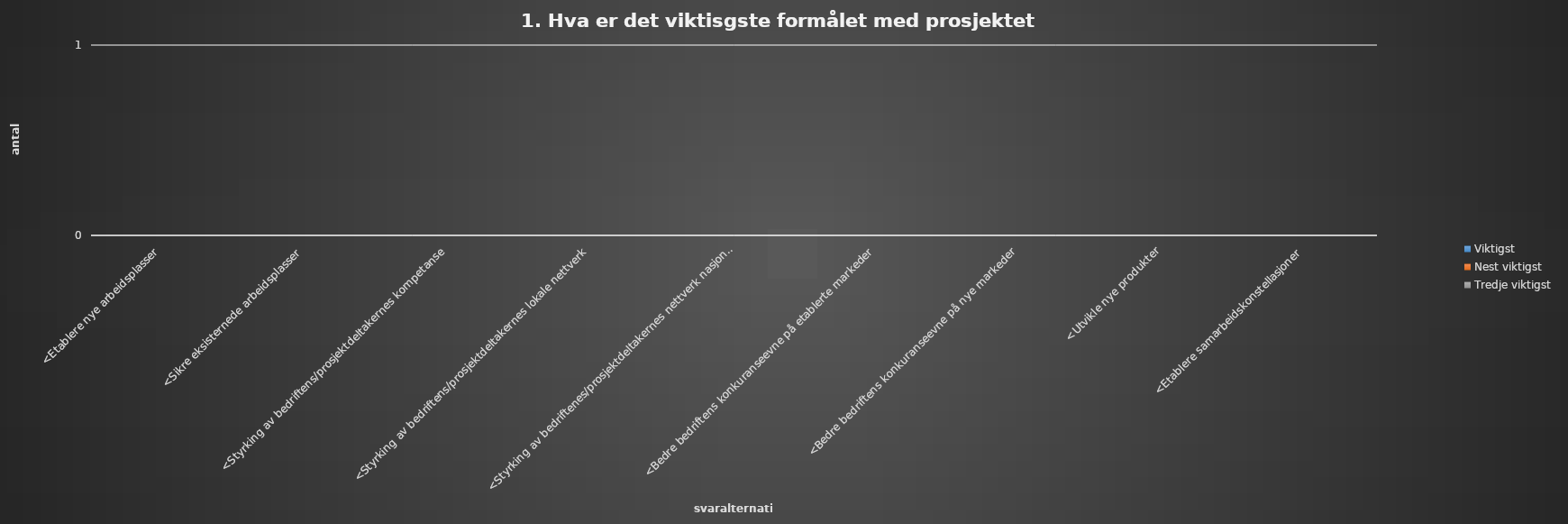
| Category | Viktigst | Nest viktigst | Tredje viktigst |
|---|---|---|---|
| <Etablere nye arbeidsplasser | 0 | 0 | 0 |
| <Sikre eksisternede arbeidsplasser | 0 | 0 | 0 |
| <Styrking av bedriftens/prosjektdeltakernes kompetanse | 0 | 0 | 0 |
| <Styrking av bedriftens/prosjektdeltakernes lokale nettverk | 0 | 0 | 0 |
| <Styrking av bedriftenes/prosjektdeltakernes nettverk nasjonalt og internasjonalt | 0 | 0 | 0 |
| <Bedre bedriftens konkuranseevne på etablerte markeder | 0 | 0 | 0 |
| <Bedre bedriftens konkuranseevne på nye markeder | 0 | 0 | 0 |
| <Utvikle nye produkter | 0 | 0 | 0 |
| <Etablere samarbeidskonstellasjoner | 0 | 0 | 0 |